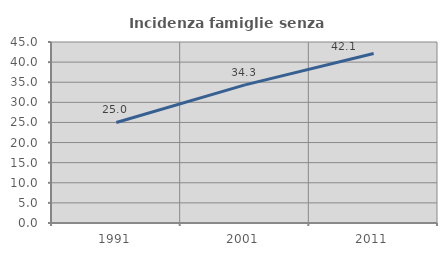
| Category | Incidenza famiglie senza nuclei |
|---|---|
| 1991.0 | 25 |
| 2001.0 | 34.333 |
| 2011.0 | 42.143 |